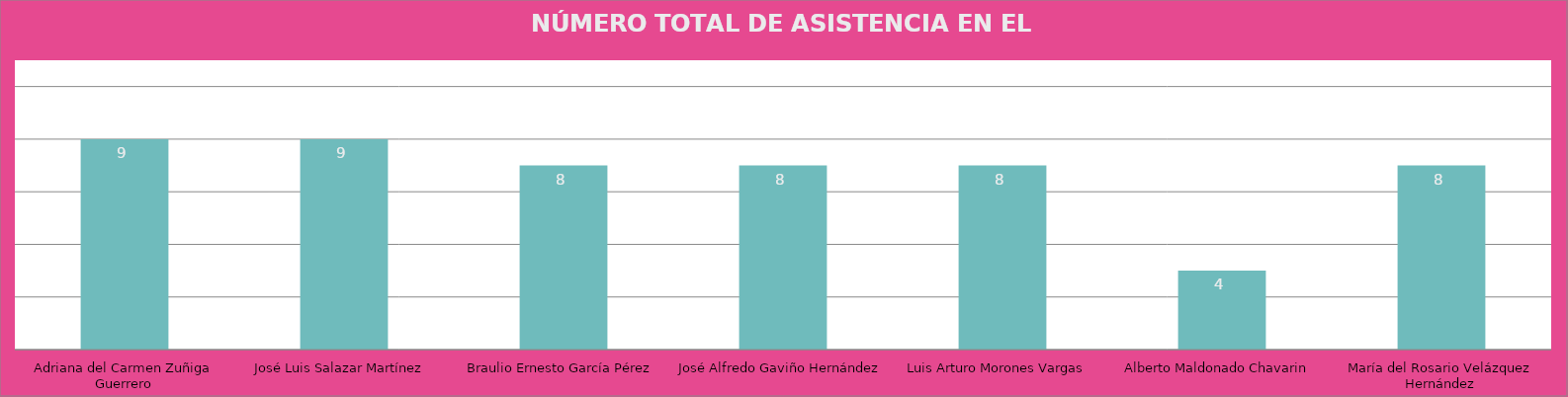
| Category | Adriana del Carmen Zuñiga Guerrero José Luis Salazar Martínez  Braulio Ernesto García Pérez José Alfredo Gaviño Hernández Luis Arturo Morones Vargas  Alberto Maldonado Chavarin  María del Rosario Velázquez Hernández |
|---|---|
| Adriana del Carmen Zuñiga Guerrero | 9 |
| José Luis Salazar Martínez  | 9 |
| Braulio Ernesto García Pérez | 8 |
| José Alfredo Gaviño Hernández | 8 |
| Luis Arturo Morones Vargas  | 8 |
| Alberto Maldonado Chavarin  | 4 |
| María del Rosario Velázquez Hernández | 8 |